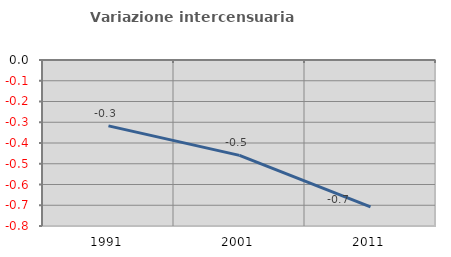
| Category | Variazione intercensuaria annua |
|---|---|
| 1991.0 | -0.318 |
| 2001.0 | -0.46 |
| 2011.0 | -0.708 |